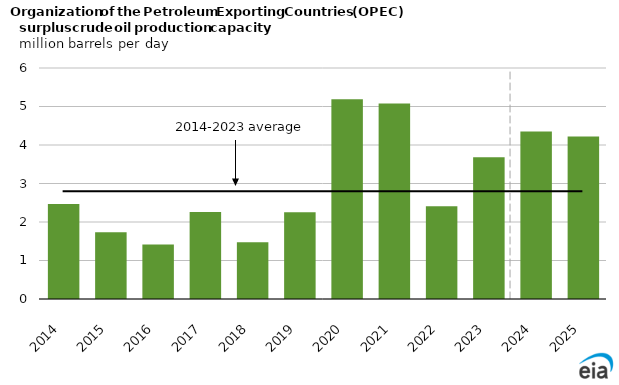
| Category | Series 1 |
|---|---|
| 2014.0 | 2.471 |
| 2015.0 | 1.735 |
| 2016.0 | 1.419 |
| 2017.0 | 2.261 |
| 2018.0 | 1.472 |
| 2019.0 | 2.252 |
| 2020.0 | 5.192 |
| 2021.0 | 5.075 |
| 2022.0 | 2.409 |
| 2023.0 | 3.68 |
| 2024.0 | 4.352 |
| 2025.0 | 4.22 |